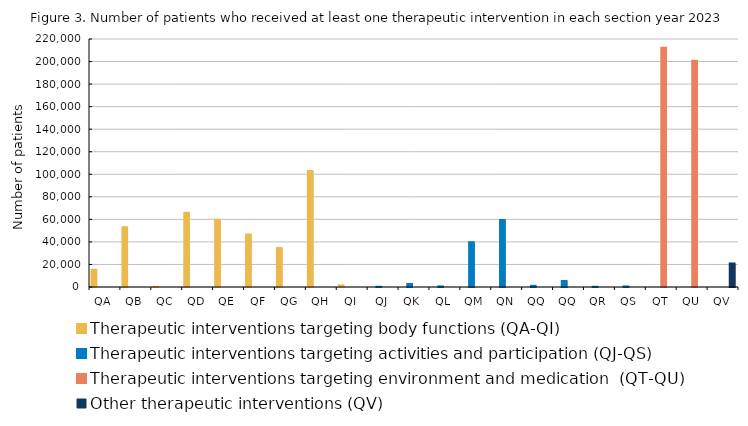
| Category | Therapeutic interventions targeting body functions (QA-QI) | Therapeutic interventions targeting activities and participation (QJ-QS) | Therapeutic interventions targeting environment and medication  (QT-QU) | Other therapeutic interventions (QV) |
|---|---|---|---|---|
| QA | 15365 | 0 | 0 | 0 |
| QB | 53091 | 0 | 0 | 0 |
| QC | 104 | 0 | 0 | 0 |
| QD | 65839 | 0 | 0 | 0 |
| QE | 59550 | 0 | 0 | 0 |
| QF | 46658 | 0 | 0 | 0 |
| QG | 34632 | 0 | 0 | 0 |
| QH | 102911 | 0 | 0 | 0 |
| QI | 1426 | 0 | 0 | 0 |
| QJ | 0 | 177 | 0 | 0 |
| QK | 0 | 2662 | 0 | 0 |
| QL | 0 | 519 | 0 | 0 |
| QM | 0 | 39693 | 0 | 0 |
| QN | 0 | 59497 | 0 | 0 |
| QQ | 0 | 1050 | 0 | 0 |
| QQ | 0 | 5257 | 0 | 0 |
| QR | 0 | 214 | 0 | 0 |
| QS | 0 | 512 | 0 | 0 |
| QT | 0 | 0 | 212320 | 0 |
| QU | 0 | 0 | 200645 | 0 |
| QV | 0 | 0 | 0 | 20762 |